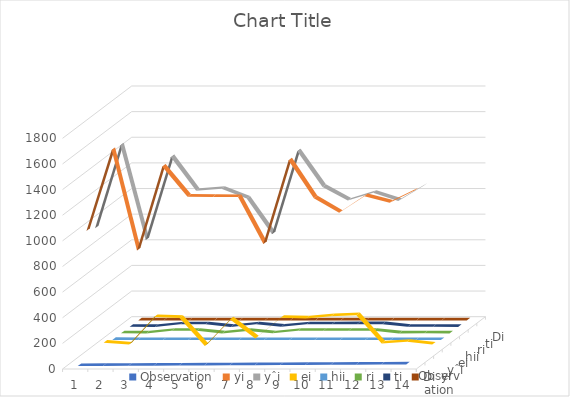
| Category | Observation | yi | yˆi | ei | hii | ri | ti | Di |
|---|---|---|---|---|---|---|---|---|
| 0 | 1 | 1004 | 973.7 | 30.3 | 0.367 | 1.092 | 1.103 | 0.231 |
| 1 | 2 | 1636 | 1620.5 | 15.5 | 0.358 | 0.553 | 0.535 | 0.057 |
| 2 | 3 | 852 | 882.4 | 230.4 | 0.317 | 21.052 | 21.057 | 0.171 |
| 3 | 4 | 1506 | 1529.2 | 223.2 | 0.31 | 20.801 | 20.787 | 0.096 |
| 4 | 5 | 1272 | 1266.7 | 5.3 | 0.092 | 0.16 | 0.153 | 0.001 |
| 5 | 6 | 1270 | 1281.9 | 211.9 | 0.133 | 20.365 | 20.35 | 0.007 |
| 6 | 7 | 1269 | 1205.8 | 63.2 | 0.148 | 1.96 | 2.316 | 0.222 |
| 7 | 8 | 903 | 928 | 225 | 0.243 | 20.823 | 20.81 | 0.072 |
| 8 | 9 | 1555 | 1574.9 | 219.9 | 0.235 | 20.651 | 20.633 | 0.043 |
| 9 | 10 | 1260 | 1297.1 | 237.1 | 0.197 | 21.185 | 21.209 | 0.115 |
| 10 | 11 | 1146 | 1190.6 | 244.6 | 0.217 | 21.442 | 21.527 | 0.192 |
| 11 | 12 | 1276 | 1251.4 | 24.6 | 0.073 | 0.73 | 0.714 | 0.014 |
| 12 | 13 | 1225 | 1187.5 | 37.5 | 0.233 | 1.225 | 1.256 | 0.152 |
| 13 | 14 | 1321 | 1305.3 | 15.7 | 0.077 | 0.466 | 0.449 | 0.006 |